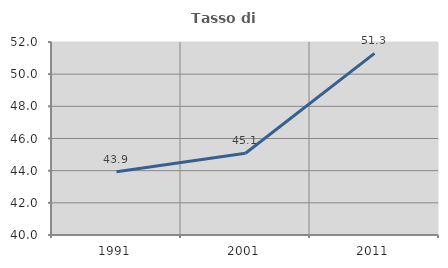
| Category | Tasso di occupazione   |
|---|---|
| 1991.0 | 43.936 |
| 2001.0 | 45.083 |
| 2011.0 | 51.293 |